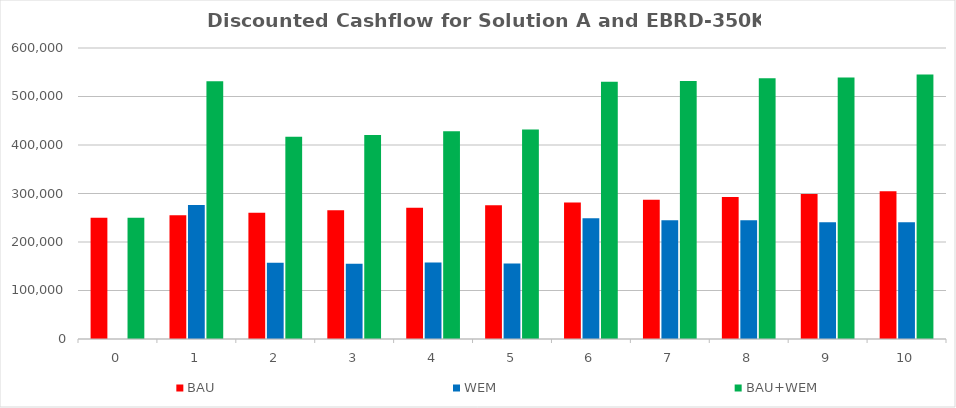
| Category | BAU | WEM | BAU+WEM |
|---|---|---|---|
| 0.0 | 250000 | 0 | 250000 |
| 1.0 | 255000 | 276280 | 531280 |
| 2.0 | 260100 | 157067 | 417167 |
| 3.0 | 265302 | 155266 | 420568 |
| 4.0 | 270608 | 157657 | 428265 |
| 5.0 | 276020 | 155738 | 431758 |
| 6.0 | 281540 | 249000 | 530540 |
| 7.0 | 287171 | 244750 | 531921 |
| 8.0 | 292914 | 244750 | 537664 |
| 9.0 | 298772 | 240500 | 539272 |
| 10.0 | 304747 | 240500 | 545247 |